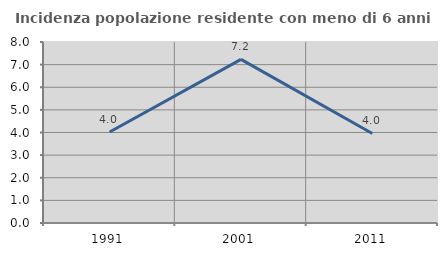
| Category | Incidenza popolazione residente con meno di 6 anni |
|---|---|
| 1991.0 | 4.024 |
| 2001.0 | 7.231 |
| 2011.0 | 3.956 |